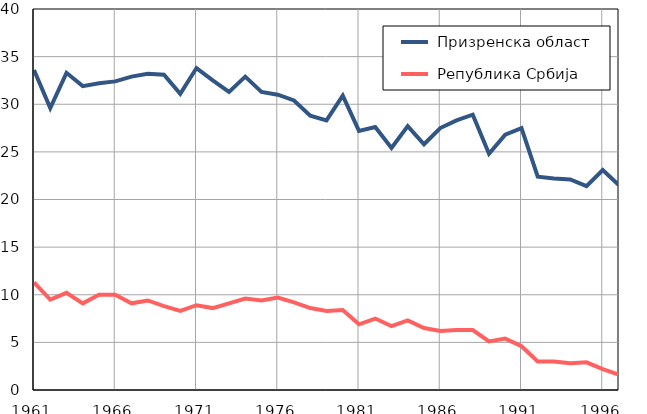
| Category |  Призренска област |  Република Србија |
|---|---|---|
| 1961.0 | 33.6 | 11.3 |
| 1962.0 | 29.6 | 9.5 |
| 1963.0 | 33.3 | 10.2 |
| 1964.0 | 31.9 | 9.1 |
| 1965.0 | 32.2 | 10 |
| 1966.0 | 32.4 | 10 |
| 1967.0 | 32.9 | 9.1 |
| 1968.0 | 33.2 | 9.4 |
| 1969.0 | 33.1 | 8.8 |
| 1970.0 | 31.1 | 8.3 |
| 1971.0 | 33.8 | 8.9 |
| 1972.0 | 32.5 | 8.6 |
| 1973.0 | 31.3 | 9.1 |
| 1974.0 | 32.9 | 9.6 |
| 1975.0 | 31.3 | 9.4 |
| 1976.0 | 31 | 9.7 |
| 1977.0 | 30.4 | 9.2 |
| 1978.0 | 28.8 | 8.6 |
| 1979.0 | 28.3 | 8.3 |
| 1980.0 | 30.9 | 8.4 |
| 1981.0 | 27.2 | 6.9 |
| 1982.0 | 27.6 | 7.5 |
| 1983.0 | 25.4 | 6.7 |
| 1984.0 | 27.7 | 7.3 |
| 1985.0 | 25.8 | 6.5 |
| 1986.0 | 27.5 | 6.2 |
| 1987.0 | 28.3 | 6.3 |
| 1988.0 | 28.9 | 6.3 |
| 1989.0 | 24.8 | 5.1 |
| 1990.0 | 26.8 | 5.4 |
| 1991.0 | 27.5 | 4.6 |
| 1992.0 | 22.4 | 3 |
| 1993.0 | 22.2 | 3 |
| 1994.0 | 22.1 | 2.8 |
| 1995.0 | 21.4 | 2.9 |
| 1996.0 | 23.1 | 2.2 |
| 1997.0 | 21.5 | 1.6 |